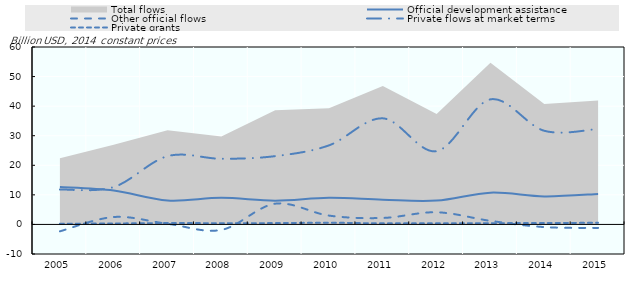
| Category | Official development assistance | Other official flows | Private flows at market terms | Private grants |
|---|---|---|---|---|
| 2005.0 | 12628.913 | -2328.963 | 11813.393 | 245.592 |
| 2006.0 | 11453.465 | 2507.314 | 12640.875 | 324.327 |
| 2007.0 | 8085.553 | 222.099 | 23087.652 | 468.769 |
| 2008.0 | 8980.042 | -1857.777 | 22203.765 | 422.517 |
| 2009.0 | 8032.043 | 7013.124 | 23092.398 | 452.604 |
| 2010.0 | 9002.771 | 2981.829 | 26734.534 | 563.301 |
| 2011.0 | 8357.309 | 2189.827 | 35878.801 | 374.754 |
| 2012.0 | 8083.651 | 4110.755 | 24769.282 | 370.973 |
| 2013.0 | 10748.762 | 1205.147 | 42298.255 | 429.628 |
| 2014.0 | 9483.29 | -898.97 | 31666.75 | 467.19 |
| 2015.0 | 10286.901 | -1179.345 | 32278.976 | 557.189 |